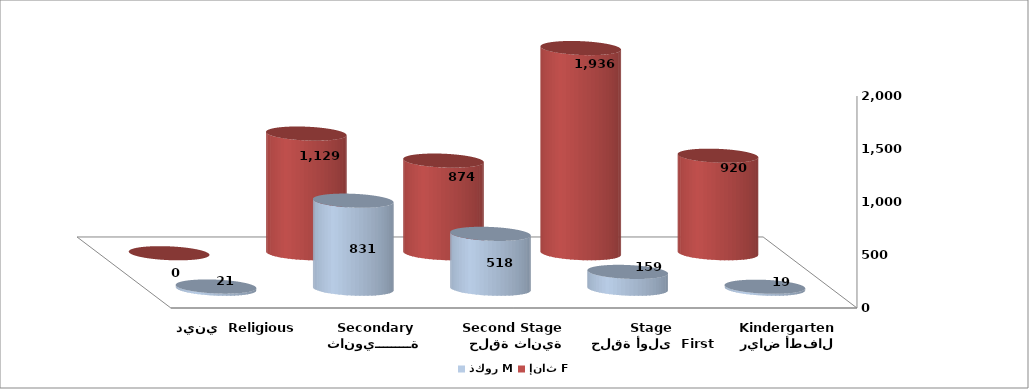
| Category | ذكور M | إناث F |
|---|---|---|
| رياض أطفال Kindergarten | 19 | 920 |
|  حلقة أولى  First Stage | 159 | 1936 |
|   حلقة ثانية  Second Stage | 518 | 874 |
| ثانويـــــــــة Secondary | 831 | 1129 |
| ديني  Religious | 21 | 0 |